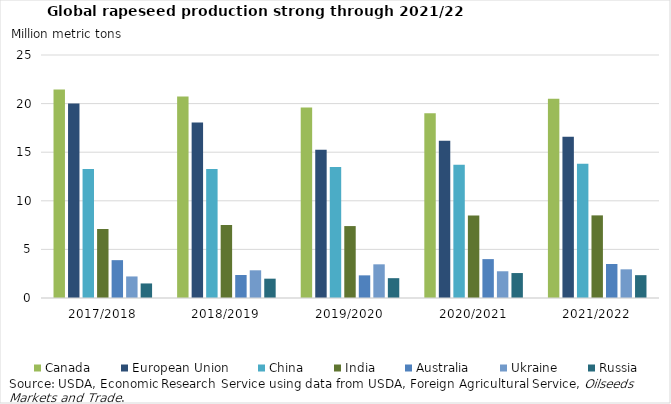
| Category | Canada | European Union | China | India | Australia | Ukraine | Russia |
|---|---|---|---|---|---|---|---|
| 2017/2018 | 21.458 | 20.017 | 13.274 | 7.1 | 3.893 | 2.217 | 1.497 |
| 2018/2019 | 20.724 | 18.048 | 13.281 | 7.5 | 2.366 | 2.85 | 1.989 |
| 2019/2020 | 19.607 | 15.241 | 13.485 | 7.4 | 2.33 | 3.465 | 2.04 |
| 2020/2021 | 19 | 16.17 | 13.7 | 8.5 | 4 | 2.75 | 2.567 |
| 2021/2022 | 20.5 | 16.6 | 13.8 | 8.5 | 3.5 | 2.95 | 2.35 |